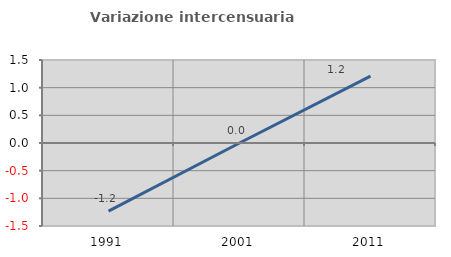
| Category | Variazione intercensuaria annua |
|---|---|
| 1991.0 | -1.232 |
| 2001.0 | 0 |
| 2011.0 | 1.207 |